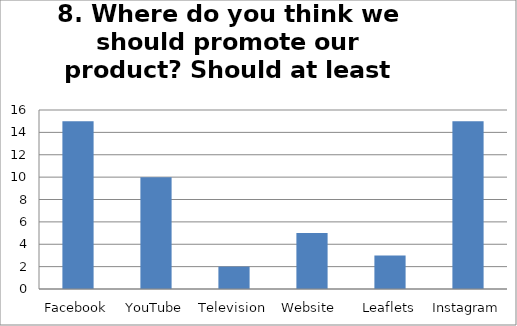
| Category | Series 0 |
|---|---|
| Facebook | 15 |
| YouTube | 10 |
| Television | 2 |
| Website  | 5 |
| Leaflets | 3 |
| Instagram | 15 |